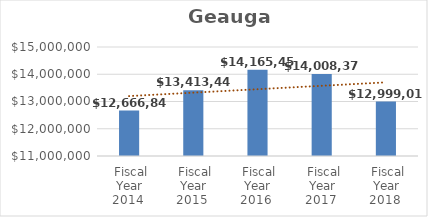
| Category | Geauga Campus |
|---|---|
| Fiscal Year 2014 | 12666846 |
| Fiscal Year 2015 | 13413443 |
| Fiscal Year 2016 | 14165458 |
| Fiscal Year 2017 | 14008376 |
| Fiscal Year 2018 | 12999017 |